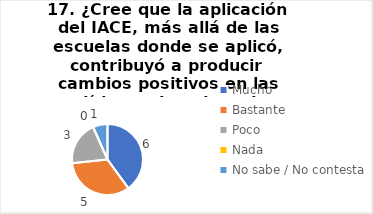
| Category | 17. ¿Cree que la aplicación del IACE, más allá de las escuelas donde se aplicó, contribuyó a producir cambios positivos en las políticas educativas de su provincia? |
|---|---|
| Mucho  | 0.4 |
| Bastante  | 0.333 |
| Poco  | 0.2 |
| Nada  | 0 |
| No sabe / No contesta | 0.067 |